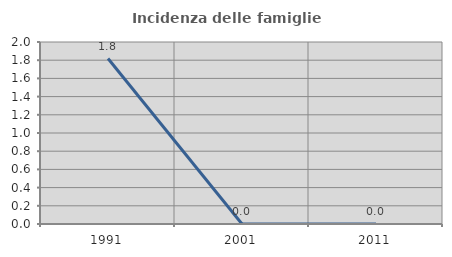
| Category | Incidenza delle famiglie numerose |
|---|---|
| 1991.0 | 1.818 |
| 2001.0 | 0 |
| 2011.0 | 0 |